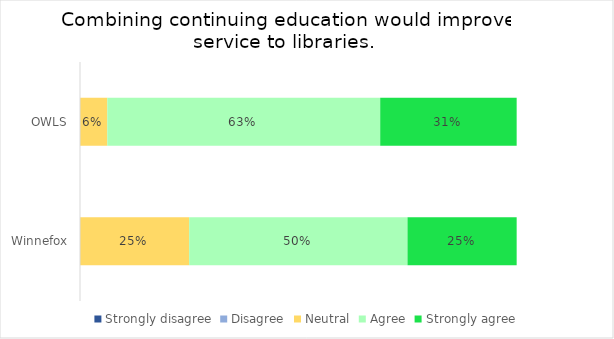
| Category | Strongly disagree | Disagree | Neutral | Agree | Strongly agree |
|---|---|---|---|---|---|
| OWLS | 0 | 0 | 0.062 | 0.625 | 0.312 |
| Winnefox | 0 | 0 | 0.25 | 0.5 | 0.25 |